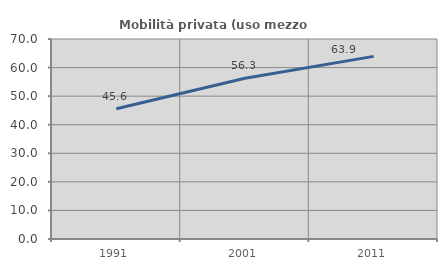
| Category | Mobilità privata (uso mezzo privato) |
|---|---|
| 1991.0 | 45.593 |
| 2001.0 | 56.277 |
| 2011.0 | 63.922 |